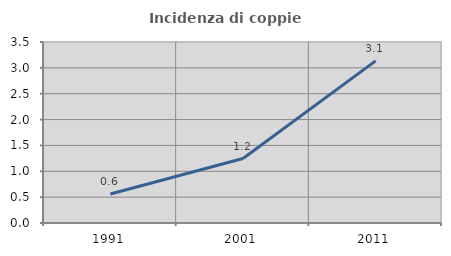
| Category | Incidenza di coppie miste |
|---|---|
| 1991.0 | 0.56 |
| 2001.0 | 1.246 |
| 2011.0 | 3.136 |